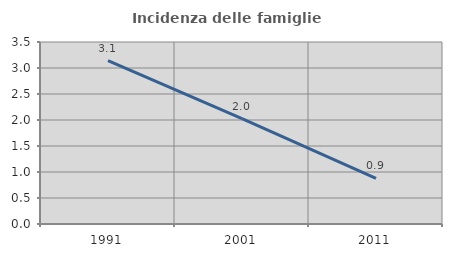
| Category | Incidenza delle famiglie numerose |
|---|---|
| 1991.0 | 3.144 |
| 2001.0 | 2.026 |
| 2011.0 | 0.879 |